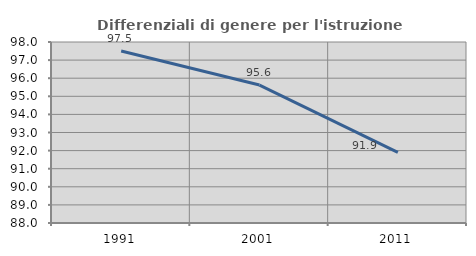
| Category | Differenziali di genere per l'istruzione superiore |
|---|---|
| 1991.0 | 97.503 |
| 2001.0 | 95.62 |
| 2011.0 | 91.899 |